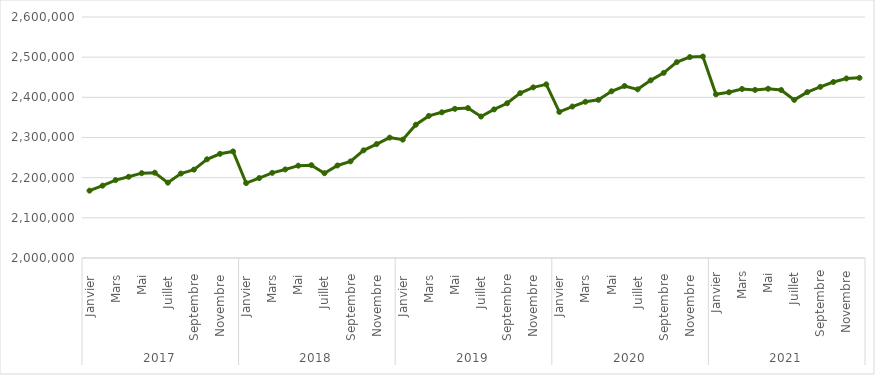
| Category | Nombre d'allocataires des Caf en Île-de-France |
|---|---|
| 0 | 2167697 |
| 1 | 2180116 |
| 2 | 2194011 |
| 3 | 2202203 |
| 4 | 2211222 |
| 5 | 2212394 |
| 6 | 2187585 |
| 7 | 2210286 |
| 8 | 2220079 |
| 9 | 2245739 |
| 10 | 2259424 |
| 11 | 2265281 |
| 12 | 2186495 |
| 13 | 2199036 |
| 14 | 2212022 |
| 15 | 2220502 |
| 16 | 2229898 |
| 17 | 2231124 |
| 18 | 2211151 |
| 19 | 2230335 |
| 20 | 2240604 |
| 21 | 2268036 |
| 22 | 2283549 |
| 23 | 2299755 |
| 24 | 2294698 |
| 25 | 2331750 |
| 26 | 2353712 |
| 27 | 2362700 |
| 28 | 2371349 |
| 29 | 2373302 |
| 30 | 2352168 |
| 31 | 2369987 |
| 32 | 2385212 |
| 33 | 2410469 |
| 34 | 2424825 |
| 35 | 2432287 |
| 36 | 2363668 |
| 37 | 2377099 |
| 38 | 2388962 |
| 39 | 2393716 |
| 40 | 2415036 |
| 41 | 2428214 |
| 42 | 2419906 |
| 43 | 2442259 |
| 44 | 2460931 |
| 45 | 2487679 |
| 46 | 2500200 |
| 47 | 2501592 |
| 48 | 2407427 |
| 49 | 2412628 |
| 50 | 2420783 |
| 51 | 2418484 |
| 52 | 2421393 |
| 53 | 2418195 |
| 54 | 2393593 |
| 55 | 2412983 |
| 56 | 2426140 |
| 57 | 2438185 |
| 58 | 2447018 |
| 59 | 2448600 |